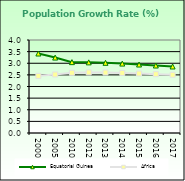
| Category | Equatorial Guinea | Africa  |
|---|---|---|
| 2000.0 | 3.419 | 2.458 |
| 2005.0 | 3.244 | 2.516 |
| 2010.0 | 3.048 | 2.59 |
| 2012.0 | 3.038 | 2.606 |
| 2013.0 | 3.018 | 2.601 |
| 2014.0 | 2.986 | 2.584 |
| 2015.0 | 2.945 | 2.559 |
| 2016.0 | 2.902 | 2.531 |
| 2017.0 | 2.861 | 2.503 |